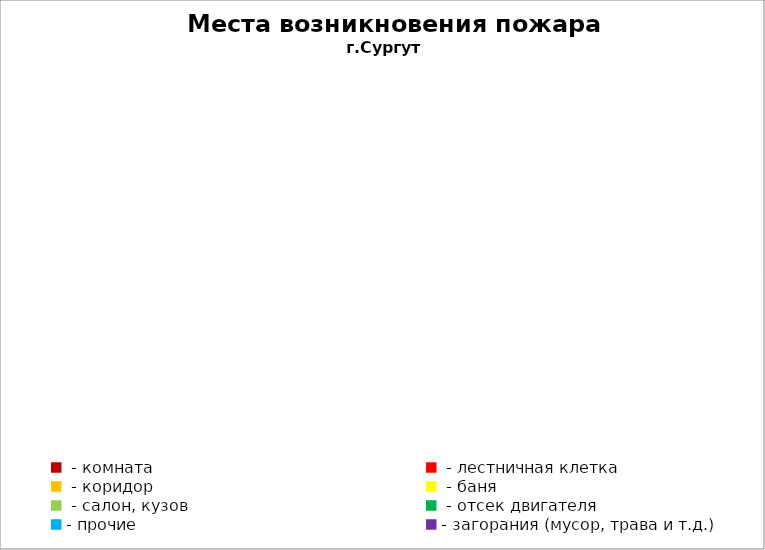
| Category | Места возникновения пожара |
|---|---|
|  - комната | 50 |
|  - лестничная клетка | 22 |
|  - коридор | 4 |
|  - баня | 33 |
|  - салон, кузов | 19 |
|  - отсек двигателя | 25 |
| - прочие | 82 |
| - загорания (мусор, трава и т.д.)  | 158 |